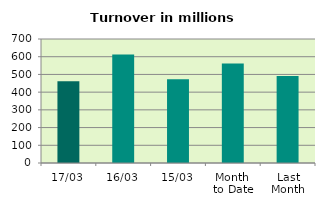
| Category | Series 0 |
|---|---|
| 17/03 | 461.563 |
| 16/03 | 612.47 |
| 15/03 | 472.749 |
| Month 
to Date | 561.133 |
| Last
Month | 490.433 |